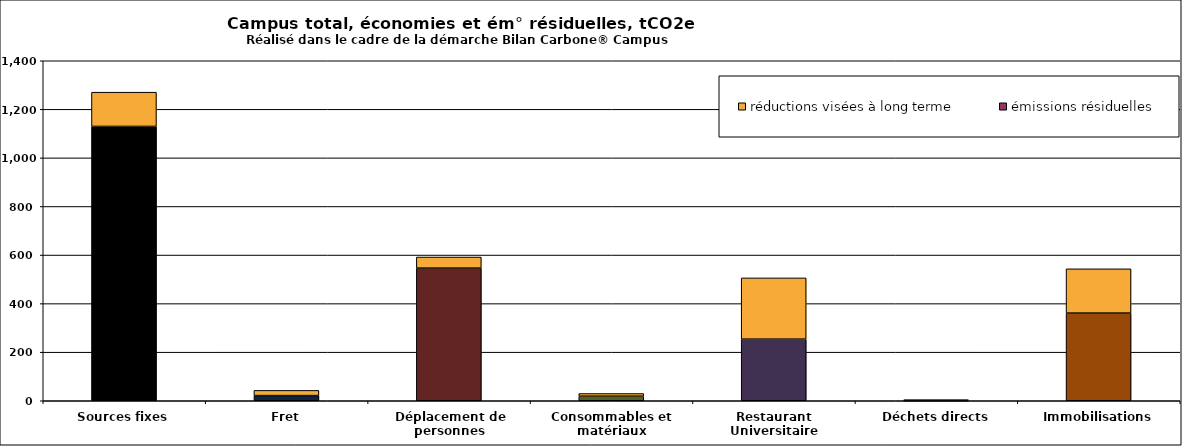
| Category | émissions résiduelles | réductions visées à long terme |
|---|---|---|
| Sources fixes | 1129.613 | 140.94 |
| Fret | 21.36 | 21.36 |
| Déplacement de personnes | 546.122 | 45.731 |
| Consommables et matériaux | 18.617 | 11.181 |
| Restaurant Universitaire | 253.737 | 252.112 |
| Déchets directs | 0.341 | 4.2 |
| Immobilisations | 360.994 | 182.244 |